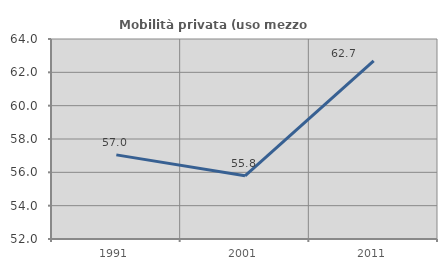
| Category | Mobilità privata (uso mezzo privato) |
|---|---|
| 1991.0 | 57.047 |
| 2001.0 | 55.793 |
| 2011.0 | 62.694 |